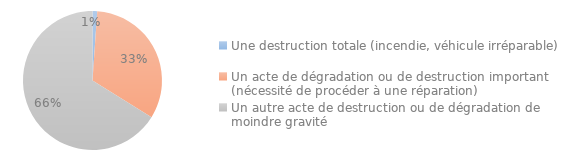
| Category | Series 0 |
|---|---|
| Une destruction totale (incendie, véhicule irréparable) | 0.011 |
| Un acte de dégradation ou de destruction important (nécessité de procéder à une réparation) | 0.328 |
| Un autre acte de destruction ou de dégradation de moindre gravité | 0.661 |